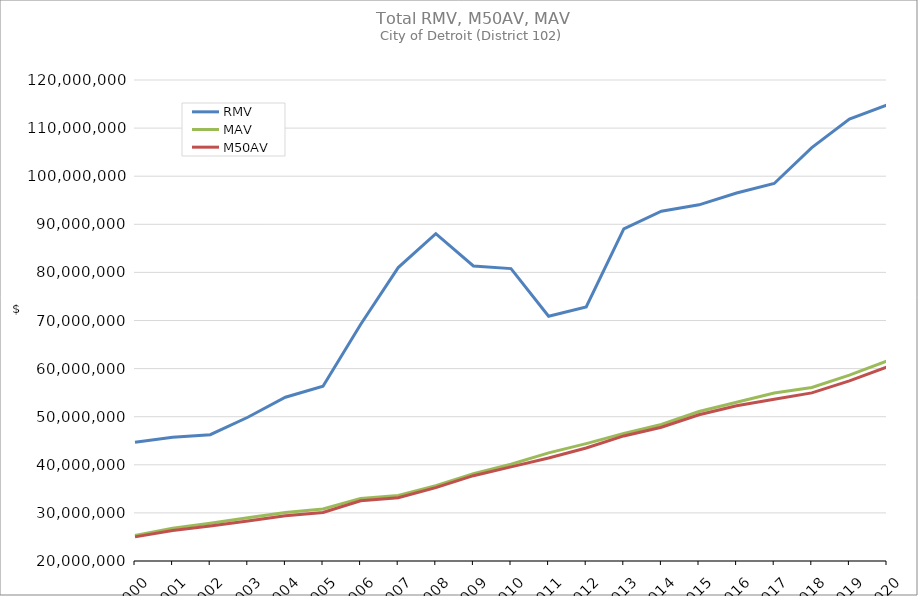
| Category | RMV | MAV | M50AV |
|---|---|---|---|
| 2000.0 | 44697170 | 25328841 | 25013062 |
| 2001.0 | 45732994 | 26833823 | 26361071 |
| 2002.0 | 46262760 | 27856182 | 27272721 |
| 2003.0 | 49887465 | 28997518 | 28331752 |
| 2004.0 | 54048937 | 30100002 | 29407487 |
| 2005.0 | 56340955 | 30804251 | 30089835 |
| 2006.0 | 69160128 | 33018987 | 32507518 |
| 2007.0 | 80995973 | 33629440 | 33144443 |
| 2008.0 | 88055146 | 35671838 | 35255146 |
| 2009.0 | 81329562 | 38141216 | 37740197 |
| 2010.0 | 80786633 | 40128234 | 39570730 |
| 2011.0 | 70873592 | 42487010 | 41412719 |
| 2012.0 | 72826593 | 44409737 | 43496381 |
| 2013.0 | 89047123 | 46514909 | 46002880 |
| 2014.0 | 92721250 | 48376320 | 47815354 |
| 2015.0 | 94044638 | 51069530 | 50400182 |
| 2016.0 | 96513290 | 53008819 | 52292142 |
| 2017.0 | 98487617 | 54938173 | 53644915 |
| 2018.0 | 105934008 | 56085981 | 54951023 |
| 2019.0 | 111889303 | 58655120 | 57448815 |
| 2020.0 | 114788885 | 61597030 | 60331310 |